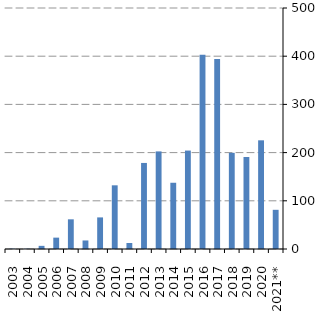
| Category | Series 0 |
|---|---|
| 2003 | 730.218 |
| 2004 | 629.963 |
| 2005 | 6535.602 |
| 2006 | 23579.863 |
| 2007 | 61574.12 |
| 2008 | 17712.827 |
| 2009 | 65560.124 |
| 2010 | 132125.327 |
| 2011 | 12479.252 |
| 2012 | 178529.675 |
| 2013 | 202478.826 |
| 2014 | 137433.229 |
| 2015 | 204217.329 |
| 2016 | 402967.89 |
| 2017 | 393931.647 |
| 2018 | 199554.102 |
| 2019 | 190876.384 |
| 2020 | 225485.52 |
| 2021** | 81295.835 |